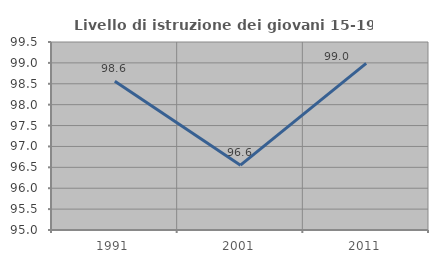
| Category | Livello di istruzione dei giovani 15-19 anni |
|---|---|
| 1991.0 | 98.561 |
| 2001.0 | 96.552 |
| 2011.0 | 98.99 |